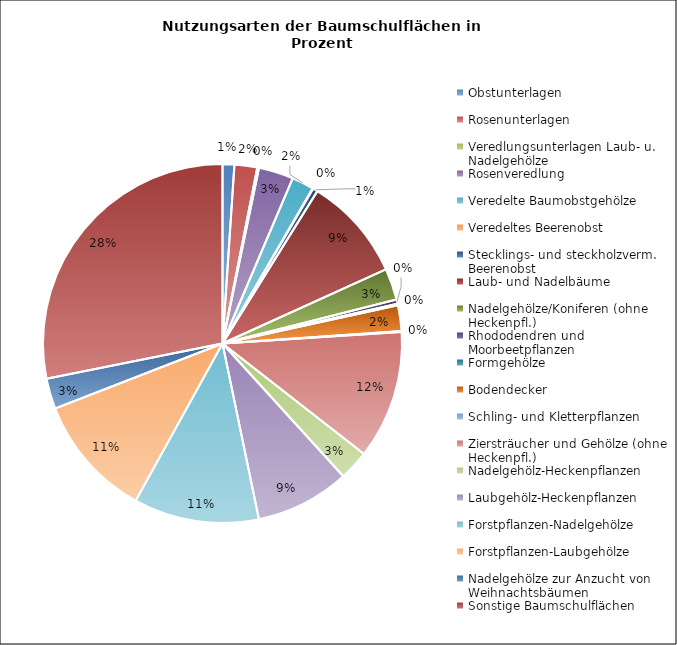
| Category | Series 0 |
|---|---|
| Obstunterlagen | 31.3 |
| Rosenunterlagen | 60.4 |
| Veredlungsunterlagen Laub- u. Nadelgehölze | 4.6 |
| Rosenveredlung | 92.4 |
| Veredelte Baumobstgehölze | 58.5 |
| Veredeltes Beerenobst | 1.5 |
| Stecklings- und steckholzverm. Beerenobst | 12.9 |
| Laub- und Nadelbäume | 276 |
| Nadelgehölze/Koniferen (ohne Heckenpfl.) | 83.9 |
| Rhododendren und Moorbeetpflanzen | 11.1 |
| Formgehölze | 4.4 |
| Bodendecker | 68.1 |
| Schling- und Kletterpflanzen | 2.4 |
| Ziersträucher und Gehölze (ohne Heckenpfl.) | 341.6 |
| Nadelgehölz-Heckenpflanzen | 79.8 |
| Laubgehölz-Heckenpflanzen | 250.6 |
| Forstpflanzen-Nadelgehölze | 333.1 |
| Forstpflanzen-Laubgehölze | 326.7 |
| Nadelgehölze zur Anzucht von Weihnachtsbäumen | 81.1 |
| Sonstige Baumschulflächen | 830.7 |